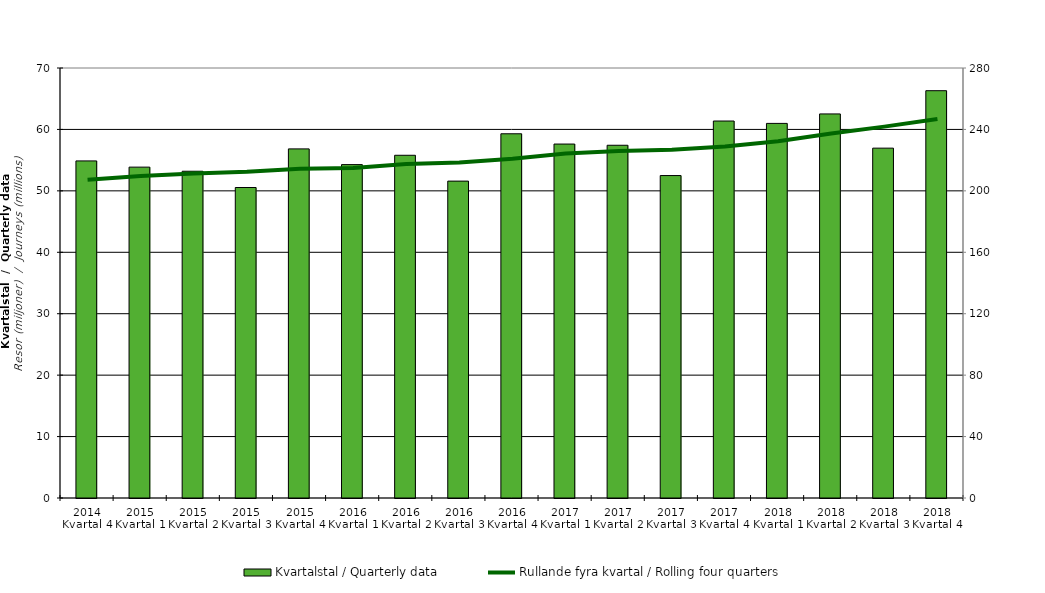
| Category | Kvartalstal / Quarterly data |
|---|---|
| 2014 Kvartal 4 | 54.874 |
| 2015 Kvartal 1 | 53.862 |
| 2015 Kvartal 2 | 53.194 |
| 2015 Kvartal 3 | 50.546 |
| 2015 Kvartal 4 | 56.832 |
| 2016 Kvartal 1 | 54.273 |
| 2016 Kvartal 2 | 55.793 |
| 2016 Kvartal 3 | 51.587 |
| 2016 Kvartal 4 | 59.293 |
| 2017 Kvartal 1 | 57.618 |
| 2017 Kvartal 2 | 57.422 |
| 2017 Kvartal 3 | 52.49 |
| 2017 Kvartal 4 | 61.369 |
| 2018 Kvartal 1 | 60.982 |
| 2018 Kvartal 2 | 62.524 |
| 2018 Kvartal 3 | 56.953 |
| 2018 Kvartal 4 | 66.306 |